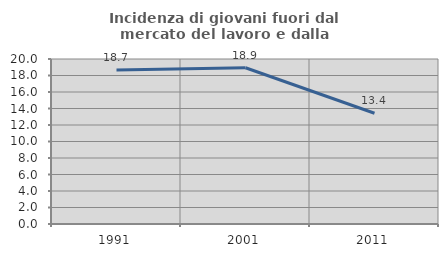
| Category | Incidenza di giovani fuori dal mercato del lavoro e dalla formazione  |
|---|---|
| 1991.0 | 18.669 |
| 2001.0 | 18.939 |
| 2011.0 | 13.425 |